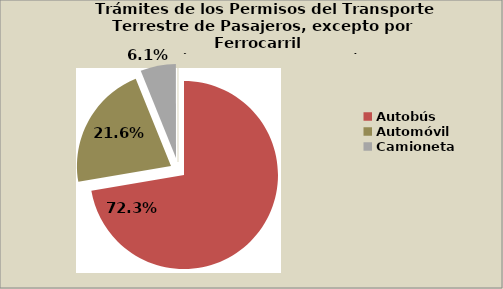
| Category | Series 0 |
|---|---|
| Autobús | 72.343 |
| Automóvil | 21.587 |
| Camioneta | 6.1 |
| Midibús | 0.025 |